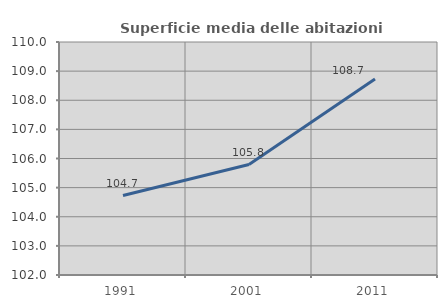
| Category | Superficie media delle abitazioni occupate |
|---|---|
| 1991.0 | 104.728 |
| 2001.0 | 105.791 |
| 2011.0 | 108.731 |